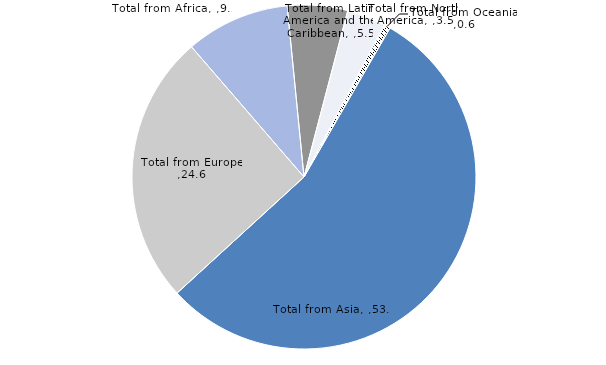
| Category | 2014 |
|---|---|
| Total from Asia | 53.141 |
| Total from Europe | 24.645 |
| Total from Africa | 9.471 |
| Total from Latin America and the Caribbean | 5.476 |
| Total from North America | 3.518 |
| Total from Oceania | 0.589 |